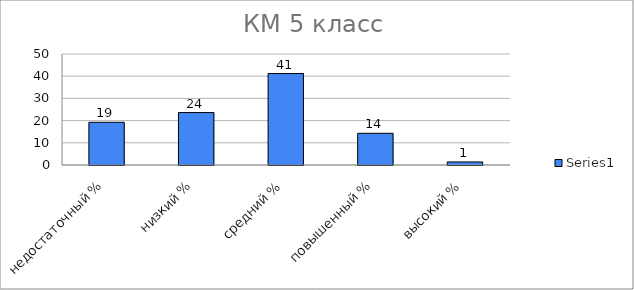
| Category | Series 0 |
|---|---|
| недостаточный % | 19.231 |
| низкий % | 23.626 |
| средний % | 41.209 |
| повышенный % | 14.286 |
| высокий % | 1.374 |